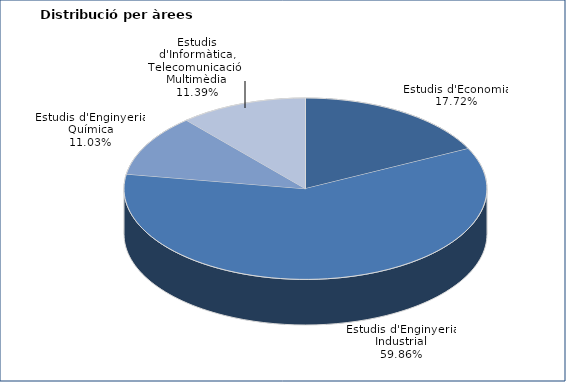
| Category | Series 0 |
|---|---|
| Estudis d'Economia | 98 |
| Estudis d'Enginyeria Industrial | 331 |
| Estudis d'Enginyeria Química | 61 |
| Estudis d'Informàtica, Telecomunicació i Multimèdia | 63 |